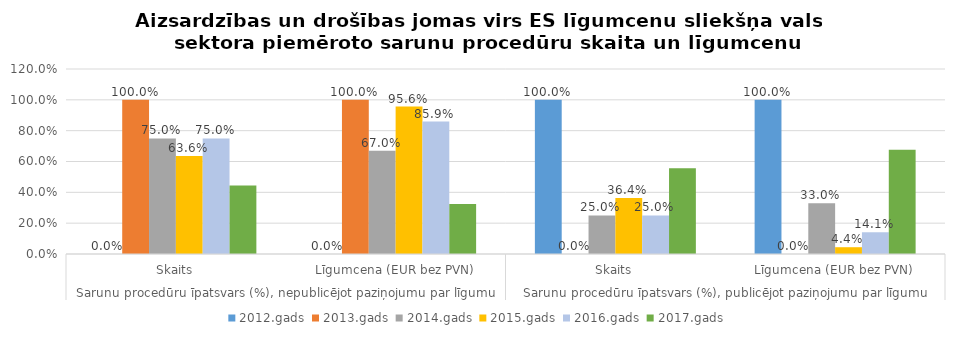
| Category | 2012.gads | 2013.gads | 2014.gads | 2015.gads | 2016.gads | 2017.gads |
|---|---|---|---|---|---|---|
| 0 | 0 | 1 | 0.75 | 0.636 | 0.75 | 0.444 |
| 1 | 0 | 1 | 0.67 | 0.956 | 0.859 | 0.324 |
| 2 | 1 | 0 | 0.25 | 0.364 | 0.25 | 0.556 |
| 3 | 1 | 0 | 0.33 | 0.044 | 0.141 | 0.676 |